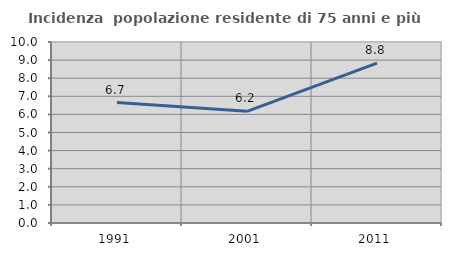
| Category | Incidenza  popolazione residente di 75 anni e più |
|---|---|
| 1991.0 | 6.652 |
| 2001.0 | 6.168 |
| 2011.0 | 8.837 |